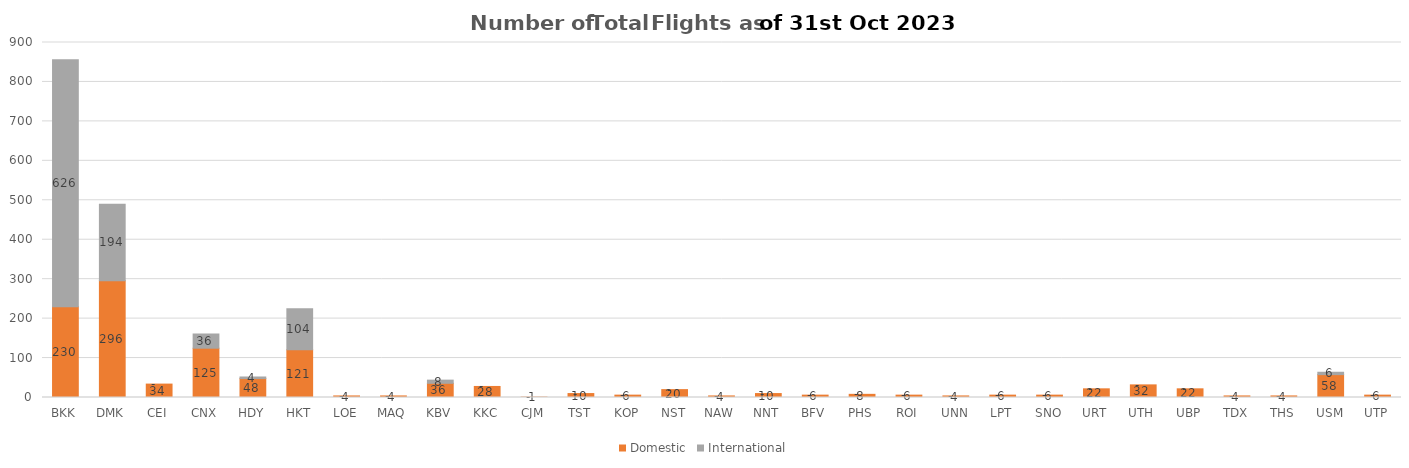
| Category | Domestic | International |
|---|---|---|
| BKK | 230 | 626 |
| DMK | 296 | 194 |
| CEI | 34 | 0 |
| CNX | 125 | 36 |
| HDY | 48 | 4 |
| HKT | 121 | 104 |
| LOE | 4 | 0 |
| MAQ | 4 | 0 |
| KBV | 36 | 8 |
| KKC | 28 | 0 |
| CJM | 1 | 0 |
| TST | 10 | 0 |
| KOP | 6 | 0 |
| NST | 20 | 0 |
| NAW | 4 | 0 |
| NNT | 10 | 0 |
| BFV | 6 | 0 |
| PHS | 8 | 0 |
| ROI | 6 | 0 |
| UNN | 4 | 0 |
| LPT | 6 | 0 |
| SNO | 6 | 0 |
| URT | 22 | 0 |
| UTH | 32 | 0 |
| UBP | 22 | 0 |
| TDX | 4 | 0 |
| THS | 4 | 0 |
| USM | 58 | 6 |
| UTP | 6 | 0 |